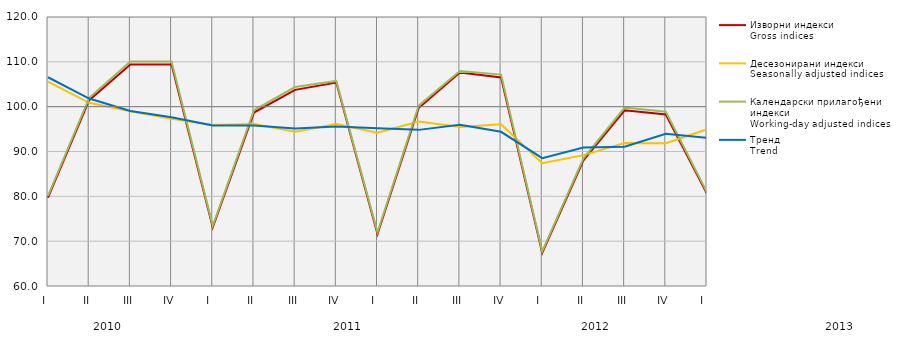
| Category | Изворни индекси
Gross indices | Десезонирани индекси
Seasonally adjusted indices | Календарски прилагођени индекси
Working-day adjusted indices | Тренд
Trend |
|---|---|---|---|---|
| I  | 79.731 | 105.595 | 80.092 | 106.559 |
| II | 101.445 | 100.862 | 101.982 | 101.805 |
| III | 109.413 | 98.993 | 110.068 | 99.053 |
| IV | 109.412 | 97.297 | 110.071 | 97.622 |
| I  | 73.105 | 95.903 | 73.416 | 95.799 |
| II | 98.686 | 96.14 | 99.209 | 95.793 |
| III | 103.754 | 94.389 | 104.384 | 95.107 |
| IV | 105.376 | 96.103 | 105.73 | 95.562 |
| I  | 71.601 | 94.17 | 71.98 | 95.184 |
| II | 99.705 | 96.711 | 100.233 | 94.825 |
| III | 107.6 | 95.492 | 107.966 | 95.991 |
| IV | 106.508 | 96.084 | 107.153 | 94.39 |
| I  | 67.411 | 87.396 | 67.702 | 88.513 |
| II | 88.026 | 89.19 | 88.493 | 90.887 |
| III | 99.2 | 91.904 | 99.804 | 91.054 |
| IV | 98.255 | 91.844 | 98.86 | 93.936 |
| I  | 80.6 | 94.959 | 80.899 | 93.065 |